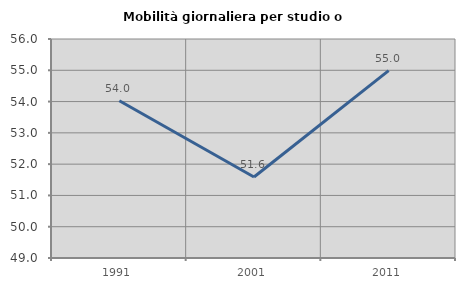
| Category | Mobilità giornaliera per studio o lavoro |
|---|---|
| 1991.0 | 54.024 |
| 2001.0 | 51.589 |
| 2011.0 | 54.991 |